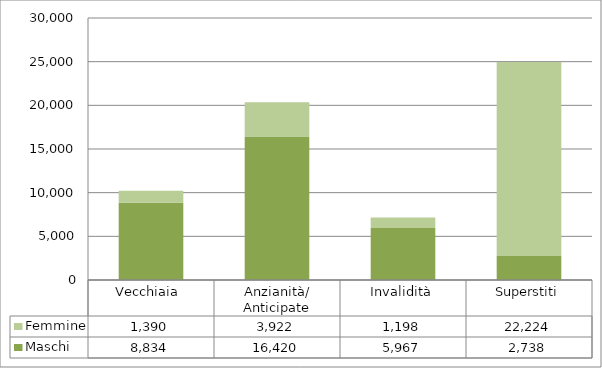
| Category | Maschi | Femmine |
|---|---|---|
| Vecchiaia  | 8834 | 1390 |
| Anzianità/ Anticipate | 16420 | 3922 |
| Invalidità | 5967 | 1198 |
| Superstiti | 2738 | 22224 |